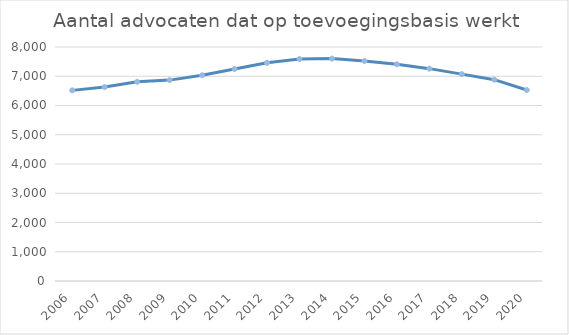
| Category | Aantal |
|---|---|
| 2006.0 | 6517 |
| 2007.0 | 6629 |
| 2008.0 | 6810 |
| 2009.0 | 6868 |
| 2010.0 | 7034 |
| 2011.0 | 7247 |
| 2012.0 | 7459 |
| 2013.0 | 7591 |
| 2014.0 | 7603 |
| 2015.0 | 7520 |
| 2016.0 | 7410 |
| 2017.0 | 7260 |
| 2018.0 | 7072 |
| 2019.0 | 6883 |
| 2020.0 | 6529 |